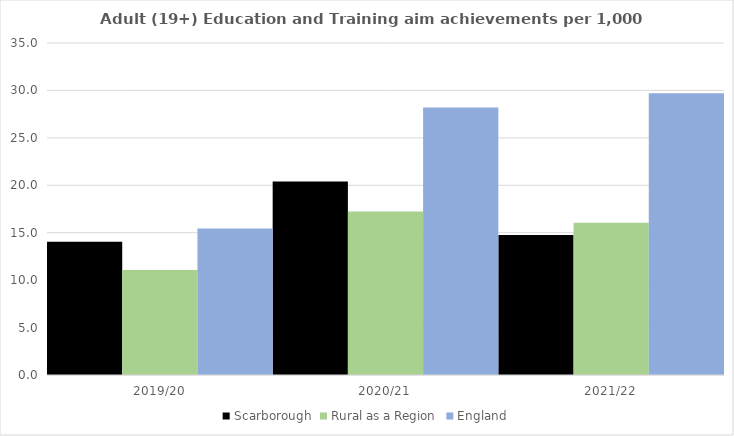
| Category | Scarborough | Rural as a Region | England |
|---|---|---|---|
| 2019/20 | 14.059 | 11.081 | 15.446 |
| 2020/21 | 20.393 | 17.224 | 28.211 |
| 2021/22 | 14.75 | 16.063 | 29.711 |